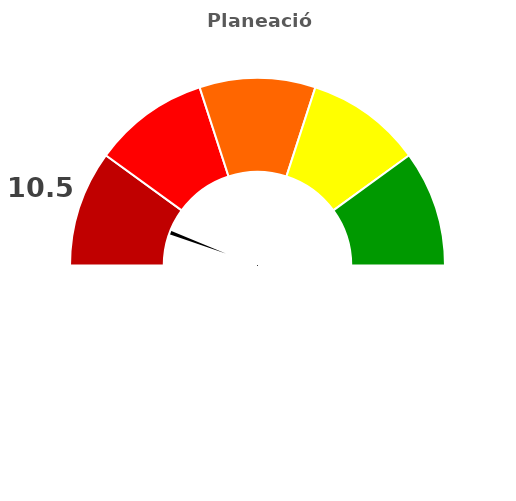
| Category | refe |
|---|---|
| 0 | 10.5 |
| 1 | 2 |
| 2 | 187.5 |